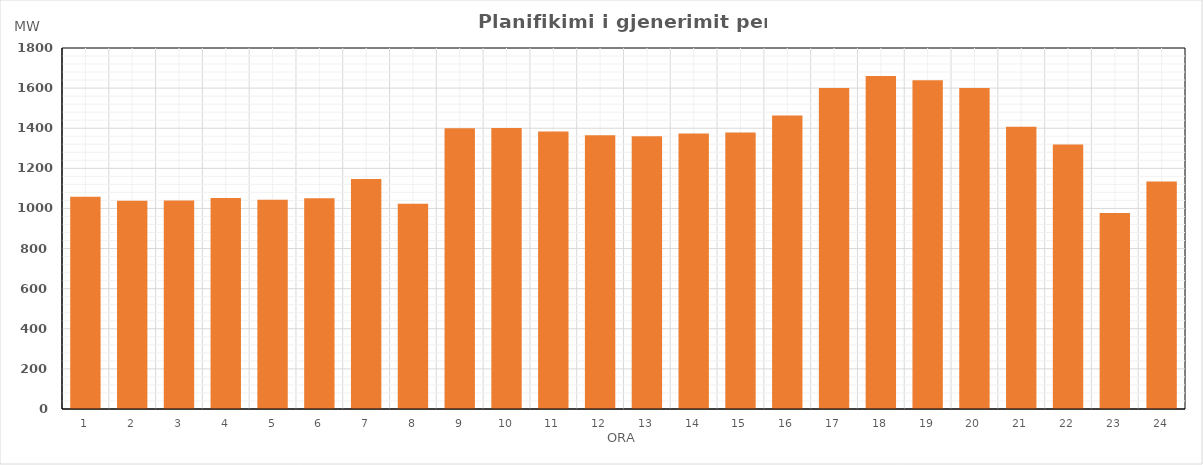
| Category | Max (MW) |
|---|---|
| 0 | 1057.87 |
| 1 | 1038.662 |
| 2 | 1039.052 |
| 3 | 1052.472 |
| 4 | 1043.068 |
| 5 | 1051.116 |
| 6 | 1146.724 |
| 7 | 1022.814 |
| 8 | 1399.908 |
| 9 | 1401.108 |
| 10 | 1383.768 |
| 11 | 1365.43 |
| 12 | 1359.476 |
| 13 | 1373.766 |
| 14 | 1378.16 |
| 15 | 1462.866 |
| 16 | 1600.1 |
| 17 | 1660.338 |
| 18 | 1639.27 |
| 19 | 1600.016 |
| 20 | 1407.092 |
| 21 | 1318.518 |
| 22 | 976.908 |
| 23 | 1134.488 |